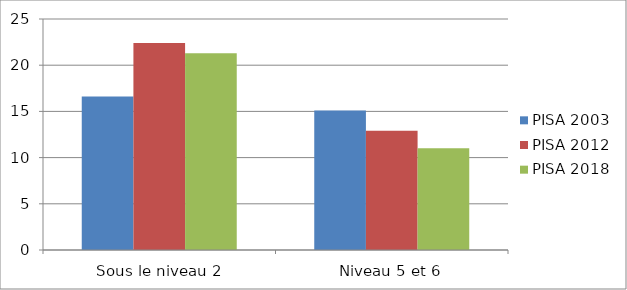
| Category | PISA 2003 | PISA 2012 | PISA 2018 |
|---|---|---|---|
| Sous le niveau 2 | 16.6 | 22.4 | 21.3 |
| Niveau 5 et 6 | 15.1 | 12.9 | 11 |